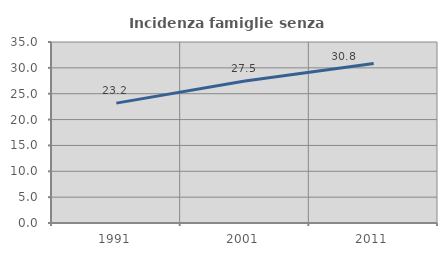
| Category | Incidenza famiglie senza nuclei |
|---|---|
| 1991.0 | 23.181 |
| 2001.0 | 27.476 |
| 2011.0 | 30.845 |